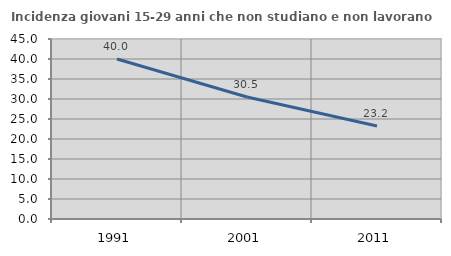
| Category | Incidenza giovani 15-29 anni che non studiano e non lavorano  |
|---|---|
| 1991.0 | 40.007 |
| 2001.0 | 30.514 |
| 2011.0 | 23.229 |